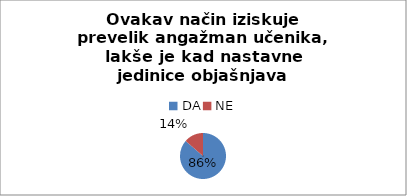
| Category | Series 0 |
|---|---|
| DA | 19 |
| NE | 3 |